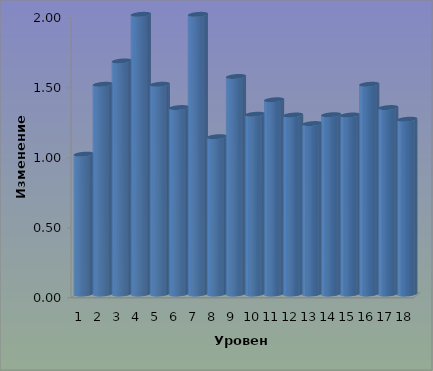
| Category | Series 0 |
|---|---|
| 0 | 1 |
| 1 | 1.5 |
| 2 | 1.667 |
| 3 | 2 |
| 4 | 1.5 |
| 5 | 1.333 |
| 6 | 2 |
| 7 | 1.125 |
| 8 | 1.556 |
| 9 | 1.286 |
| 10 | 1.389 |
| 11 | 1.28 |
| 12 | 1.219 |
| 13 | 1.282 |
| 14 | 1.28 |
| 15 | 1.5 |
| 16 | 1.333 |
| 17 | 1.25 |